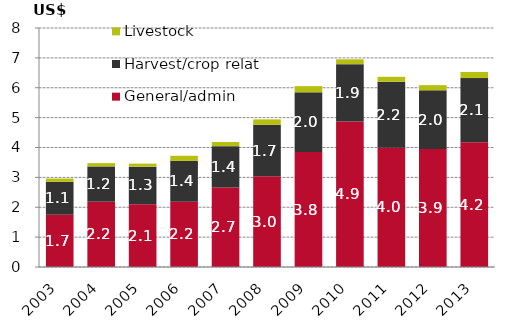
| Category | General/admin | Harvest/crop related | Livestock |
|---|---|---|---|
| 2003.0 | 1749.917 | 1098.542 | 112.068 |
| 2004.0 | 2185.078 | 1181.253 | 110.433 |
| 2005.0 | 2100.631 | 1257.065 | 102.826 |
| 2006.0 | 2187.112 | 1367.233 | 168.867 |
| 2007.0 | 2664.209 | 1381.309 | 138.617 |
| 2008.0 | 3037.626 | 1722.749 | 181.63 |
| 2009.0 | 3847.07 | 1998.173 | 208.495 |
| 2010.0 | 4870.043 | 1919.931 | 162.092 |
| 2011.0 | 3992.822 | 2208.277 | 165.327 |
| 2012.0 | 3947.393 | 1966.217 | 173.758 |
| 2013.0 | 4173.639 | 2149.983 | 203.367 |